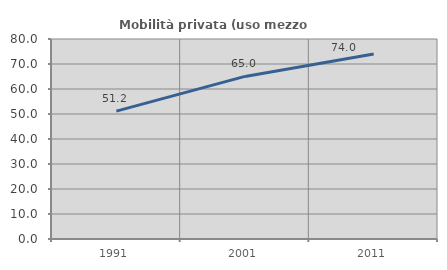
| Category | Mobilità privata (uso mezzo privato) |
|---|---|
| 1991.0 | 51.164 |
| 2001.0 | 65.03 |
| 2011.0 | 73.972 |